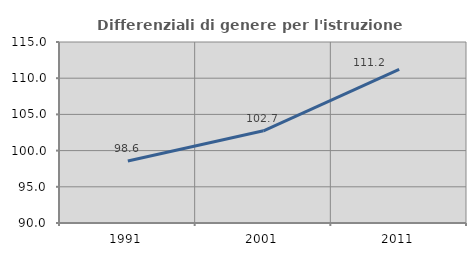
| Category | Differenziali di genere per l'istruzione superiore |
|---|---|
| 1991.0 | 98.564 |
| 2001.0 | 102.74 |
| 2011.0 | 111.233 |